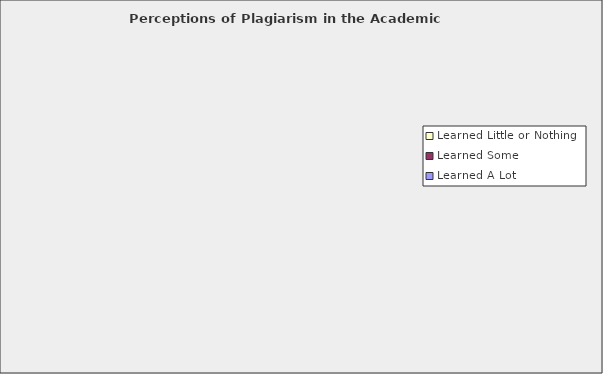
| Category | Learned A Lot | Learned Some | Learned Little or Nothing |
|---|---|---|---|
| Graduate orientation program | 83 | 291 | 176 |
| University of Florida website | 54 | 209 | 274 |
| Program Director or Advisor | 88 | 212 | 238 |
| Faculty (e.g., discussed in class, course syllabi, or course outlines) | 238 | 287 | 62 |
| Librarian/Library | 26 | 67 | 430 |
| Other students | 39 | 124 | 345 |